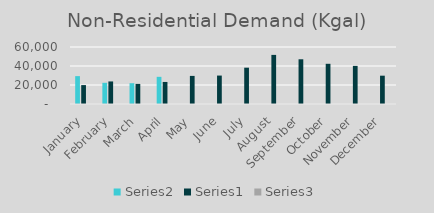
| Category | Series 1 | Series 0 | Series 2 |
|---|---|---|---|
| January | 29345 | 19908 | 1.474 |
| February | 22317.599 | 23745 | 0.94 |
| March | 21887.421 | 21154 | 1.035 |
| April | 28601.111 | 23203.745 | 1.233 |
| May | 0 | 29574.268 | 0 |
| June | 0 | 29931.133 | 0 |
| July | 0 | 38220.373 | 0 |
| August | 0 | 51691.008 | 0 |
| September | 0 | 47078.323 | 0 |
| October | 0 | 42320.849 | 0 |
| November | 0 | 40123.835 | 0 |
| December | 0 | 29804.055 | 0 |